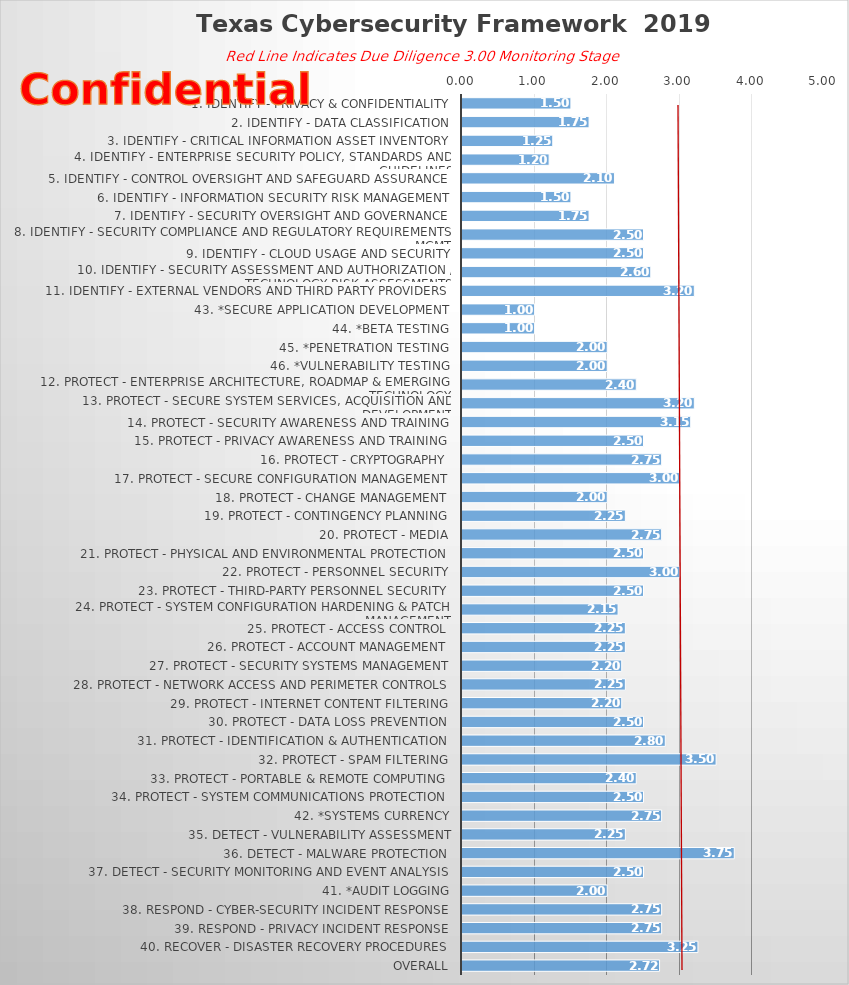
| Category | TCF Rating |
|---|---|
| 1. Identify - Privacy & Confidentiality | 1.5 |
| 2. Identify - Data Classification | 1.75 |
| 3. Identify - Critical Information Asset Inventory | 1.25 |
| 4. Identify - Enterprise Security Policy, Standards and Guidelines | 1.2 |
| 5. Identify - Control Oversight and Safeguard Assurance | 2.1 |
| 6. Identify - Information Security Risk Management | 1.5 |
| 7. Identify - Security Oversight and Governance | 1.75 |
| 8. Identify - Security Compliance and Regulatory Requirements Mgmt | 2.5 |
| 9. Identify - Cloud Usage and Security | 2.5 |
| 10. Identify - Security Assessment and Authorization / Technology Risk Assessments | 2.6 |
| 11. Identify - External Vendors and Third Party Providers | 3.2 |
| 43. *Secure Application Development | 1 |
| 44. *Beta Testing | 1 |
| 45. *Penetration Testing | 2 |
| 46. *Vulnerability Testing | 2 |
| 12. Protect - Enterprise Architecture, Roadmap & Emerging Technology | 2.4 |
| 13. Protect - Secure System Services, Acquisition and Development | 3.2 |
| 14. Protect - Security Awareness and Training | 3.15 |
| 15. Protect - Privacy Awareness and Training | 2.5 |
| 16. Protect - Cryptography | 2.75 |
| 17. Protect - Secure Configuration Management | 3 |
| 18. Protect - Change Management | 2 |
| 19. Protect - Contingency Planning | 2.25 |
| 20. Protect - Media | 2.75 |
| 21. Protect - Physical and Environmental Protection | 2.5 |
| 22. Protect - Personnel Security | 3 |
| 23. Protect - Third-Party Personnel Security | 2.5 |
| 24. Protect - System Configuration Hardening & Patch Management | 2.15 |
| 25. Protect - Access Control | 2.25 |
| 26. Protect - Account Management | 2.25 |
| 27. Protect - Security Systems Management | 2.2 |
| 28. Protect - Network Access and Perimeter Controls | 2.25 |
| 29. Protect - Internet Content Filtering | 2.2 |
| 30. Protect - Data Loss Prevention | 2.5 |
| 31. Protect - Identification & Authentication | 2.8 |
| 32. Protect - Spam Filtering | 3.5 |
| 33. Protect - Portable & Remote Computing | 2.4 |
| 34. Protect - System Communications Protection | 2.5 |
| 42. *Systems Currency | 2.75 |
| 35. Detect - Vulnerability Assessment | 2.25 |
| 36. Detect - Malware Protection | 3.75 |
| 37. Detect - Security Monitoring and Event Analysis | 2.5 |
| 41. *Audit Logging | 2 |
| 38. Respond - Cyber-Security Incident Response | 2.75 |
| 39. Respond - Privacy Incident Response | 2.75 |
| 40. Recover - Disaster Recovery Procedures | 3.25 |
| Overall | 2.721 |